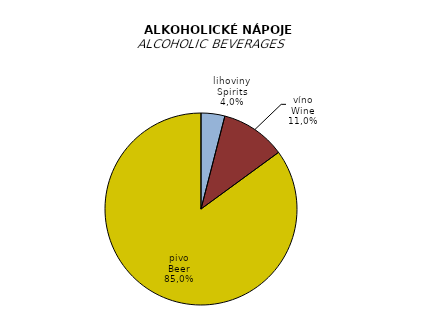
| Category | 2015 |
|---|---|
| lihoviny | 6.9 |
| víno | 18.9 |
| pivo | 146.6 |